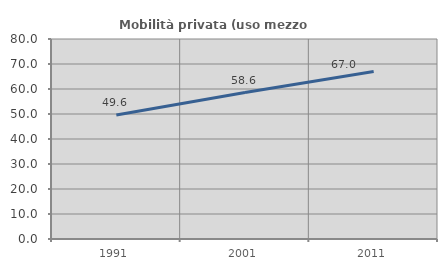
| Category | Mobilità privata (uso mezzo privato) |
|---|---|
| 1991.0 | 49.628 |
| 2001.0 | 58.577 |
| 2011.0 | 66.98 |